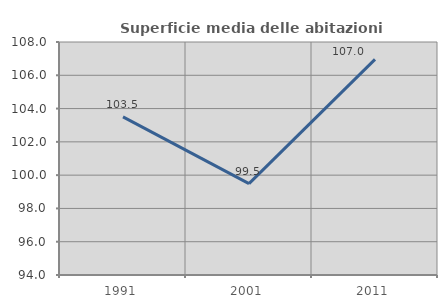
| Category | Superficie media delle abitazioni occupate |
|---|---|
| 1991.0 | 103.502 |
| 2001.0 | 99.494 |
| 2011.0 | 106.959 |